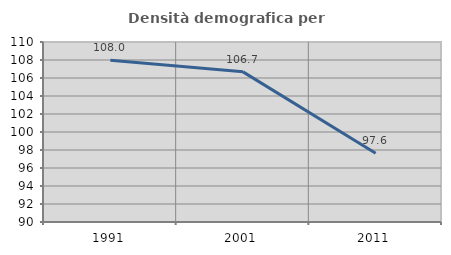
| Category | Densità demografica |
|---|---|
| 1991.0 | 107.964 |
| 2001.0 | 106.684 |
| 2011.0 | 97.637 |